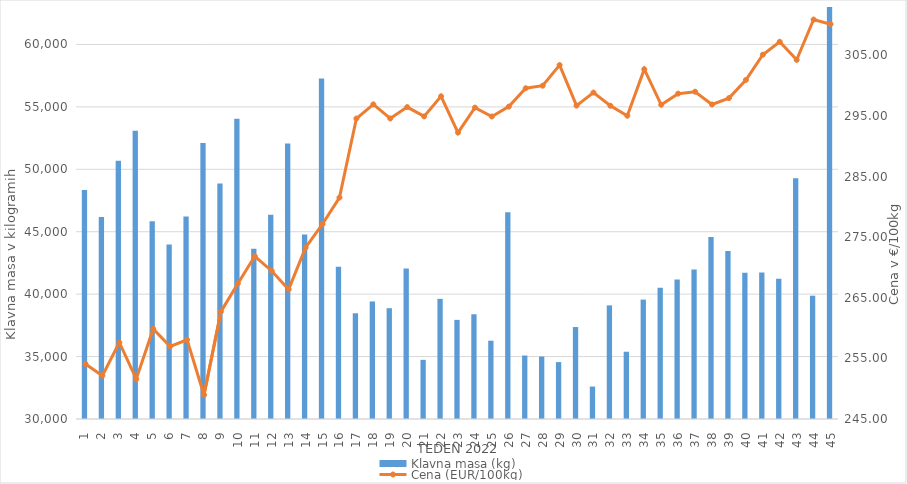
| Category | Klavna masa (kg) |
|---|---|
| 1.0 | 48349 |
| 2.0 | 46187 |
| 3.0 | 50692 |
| 4.0 | 53081 |
| 5.0 | 45844 |
| 6.0 | 43982 |
| 7.0 | 46227 |
| 8.0 | 52099 |
| 9.0 | 48872 |
| 10.0 | 54045 |
| 11.0 | 43645 |
| 12.0 | 46350 |
| 13.0 | 52061 |
| 14.0 | 44774 |
| 15.0 | 57268 |
| 16.0 | 42191 |
| 17.0 | 38469 |
| 18.0 | 39417 |
| 19.0 | 38876 |
| 20.0 | 42047 |
| 21.0 | 34739 |
| 22.0 | 39626 |
| 23.0 | 37939 |
| 24.0 | 38390 |
| 25.0 | 36272 |
| 26.0 | 46553 |
| 27.0 | 35085 |
| 28.0 | 35007 |
| 29.0 | 34559 |
| 30.0 | 37366 |
| 31.0 | 32599 |
| 32.0 | 39100 |
| 33.0 | 35388 |
| 34.0 | 39563 |
| 35.0 | 40507 |
| 36.0 | 41176 |
| 37.0 | 41983 |
| 38.0 | 44572 |
| 39.0 | 43447 |
| 40.0 | 41711 |
| 41.0 | 41736 |
| 42.0 | 41239 |
| 43.0 | 49284 |
| 44.0 | 39877 |
| 45.0 | 63668 |